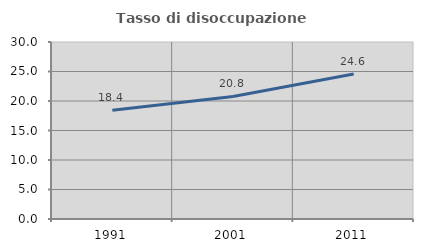
| Category | Tasso di disoccupazione giovanile  |
|---|---|
| 1991.0 | 18.421 |
| 2001.0 | 20.779 |
| 2011.0 | 24.59 |